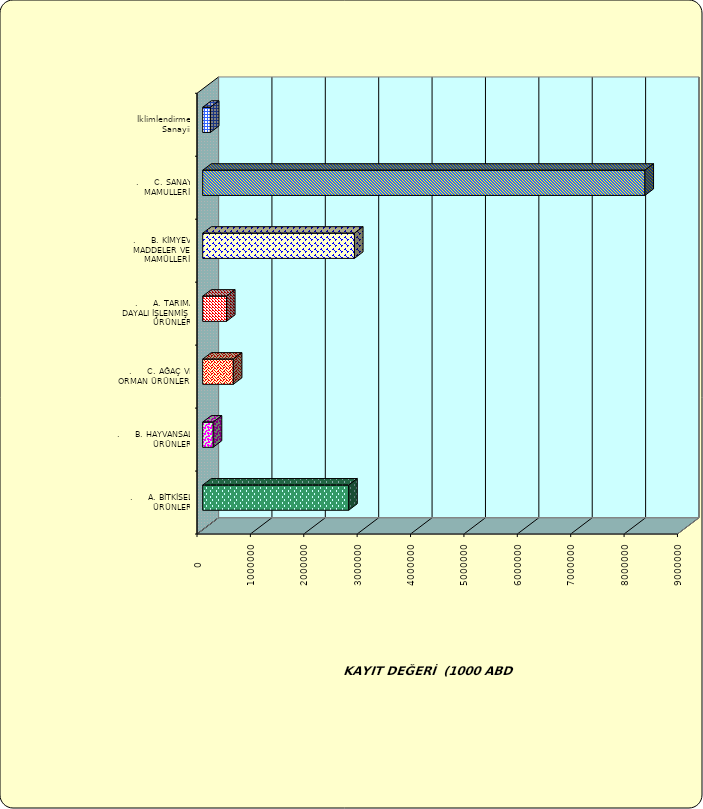
| Category | Series 0 |
|---|---|
| .     A. BİTKİSEL ÜRÜNLER | 2734652.383 |
| .     B. HAYVANSAL ÜRÜNLER | 196475.927 |
| .     C. AĞAÇ VE ORMAN ÜRÜNLERİ | 573706.4 |
| .     A. TARIMA DAYALI İŞLENMİŞ ÜRÜNLER | 445425.342 |
| .     B. KİMYEVİ MADDELER VE MAMÜLLERİ | 2843001.74 |
| .     C. SANAYİ MAMULLERİ | 8284091.633 |
|  İklimlendirme Sanayii | 143960.447 |